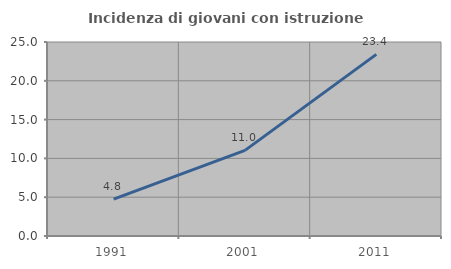
| Category | Incidenza di giovani con istruzione universitaria |
|---|---|
| 1991.0 | 4.762 |
| 2001.0 | 11.029 |
| 2011.0 | 23.404 |